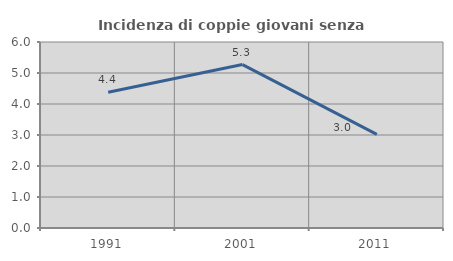
| Category | Incidenza di coppie giovani senza figli |
|---|---|
| 1991.0 | 4.378 |
| 2001.0 | 5.272 |
| 2011.0 | 3.019 |